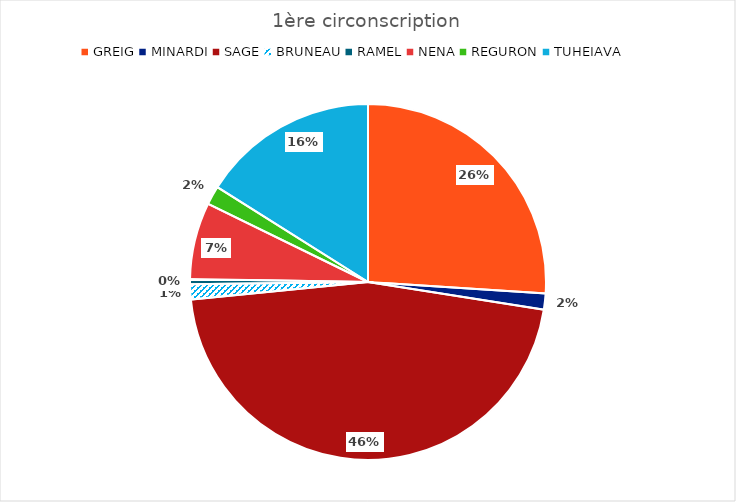
| Category | Series 0 |
|---|---|
| GREIG | 7717 |
| MINARDI | 434 |
| SAGE | 13626 |
| BRUNEAU | 408 |
| RAMEL | 136 |
| NENA | 2070 |
| REGURON | 504 |
| TUHEIAVA | 4764 |